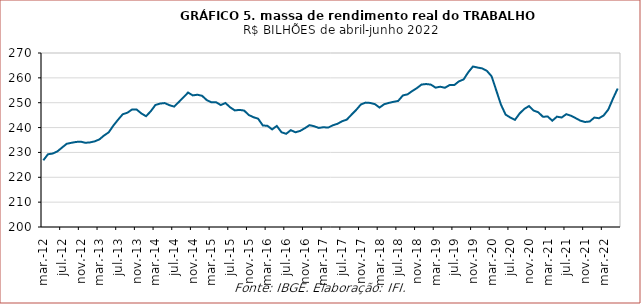
| Category | Massa de rendimento real do trabalho |
|---|---|
| 2012-03-01 | 226834 |
| 2012-04-01 | 229276 |
| 2012-05-01 | 229546 |
| 2012-06-01 | 230411 |
| 2012-07-01 | 231943 |
| 2012-08-01 | 233470 |
| 2012-09-01 | 233874 |
| 2012-10-01 | 234216 |
| 2012-11-01 | 234345 |
| 2012-12-01 | 233879 |
| 2013-01-01 | 234032 |
| 2013-02-01 | 234455 |
| 2013-03-01 | 235233 |
| 2013-04-01 | 236811 |
| 2013-05-01 | 238074 |
| 2013-06-01 | 240798 |
| 2013-07-01 | 243159 |
| 2013-08-01 | 245346 |
| 2013-09-01 | 245982 |
| 2013-10-01 | 247260 |
| 2013-11-01 | 247222 |
| 2013-12-01 | 245670 |
| 2014-01-01 | 244571 |
| 2014-02-01 | 246548 |
| 2014-03-01 | 249080 |
| 2014-04-01 | 249656 |
| 2014-05-01 | 249855 |
| 2014-06-01 | 249010 |
| 2014-07-01 | 248442 |
| 2014-08-01 | 250238 |
| 2014-09-01 | 252174 |
| 2014-10-01 | 254083 |
| 2014-11-01 | 252948 |
| 2014-12-01 | 253214 |
| 2015-01-01 | 252782 |
| 2015-02-01 | 251057 |
| 2015-03-01 | 250140 |
| 2015-04-01 | 250193 |
| 2015-05-01 | 249060 |
| 2015-06-01 | 249889 |
| 2015-07-01 | 248162 |
| 2015-08-01 | 246897 |
| 2015-09-01 | 247117 |
| 2015-10-01 | 246844 |
| 2015-11-01 | 245060 |
| 2015-12-01 | 244170 |
| 2016-01-01 | 243570 |
| 2016-02-01 | 240860 |
| 2016-03-01 | 240694 |
| 2016-04-01 | 239264 |
| 2016-05-01 | 240653 |
| 2016-06-01 | 238121 |
| 2016-07-01 | 237488 |
| 2016-08-01 | 238957 |
| 2016-09-01 | 238106 |
| 2016-10-01 | 238653 |
| 2016-11-01 | 239742 |
| 2016-12-01 | 240977 |
| 2017-01-01 | 240529 |
| 2017-02-01 | 239857 |
| 2017-03-01 | 240144 |
| 2017-04-01 | 239983 |
| 2017-05-01 | 240920 |
| 2017-06-01 | 241521 |
| 2017-07-01 | 242557 |
| 2017-08-01 | 243210 |
| 2017-09-01 | 245201 |
| 2017-10-01 | 247094 |
| 2017-11-01 | 249284 |
| 2017-12-01 | 250041 |
| 2018-01-01 | 249917 |
| 2018-02-01 | 249435 |
| 2018-03-01 | 248054 |
| 2018-04-01 | 249397 |
| 2018-05-01 | 249928 |
| 2018-06-01 | 250357 |
| 2018-07-01 | 250732 |
| 2018-08-01 | 252930 |
| 2018-09-01 | 253372 |
| 2018-10-01 | 254687 |
| 2018-11-01 | 255869 |
| 2018-12-01 | 257311 |
| 2019-01-01 | 257513 |
| 2019-02-01 | 257282 |
| 2019-03-01 | 256060 |
| 2019-04-01 | 256431 |
| 2019-05-01 | 256020 |
| 2019-06-01 | 257087 |
| 2019-07-01 | 257083 |
| 2019-08-01 | 258586 |
| 2019-09-01 | 259364 |
| 2019-10-01 | 262229 |
| 2019-11-01 | 264566 |
| 2019-12-01 | 264143 |
| 2020-01-01 | 263795 |
| 2020-02-01 | 262793 |
| 2020-03-01 | 260633 |
| 2020-04-01 | 254962 |
| 2020-05-01 | 249251 |
| 2020-06-01 | 245215 |
| 2020-07-01 | 244048 |
| 2020-08-01 | 243086 |
| 2020-09-01 | 245655 |
| 2020-10-01 | 247499 |
| 2020-11-01 | 248647 |
| 2020-12-01 | 246851 |
| 2021-01-01 | 246155 |
| 2021-02-01 | 244341 |
| 2021-03-01 | 244468 |
| 2021-04-01 | 242766 |
| 2021-05-01 | 244393 |
| 2021-06-01 | 244044 |
| 2021-07-01 | 245384 |
| 2021-08-01 | 244770 |
| 2021-09-01 | 243801 |
| 2021-10-01 | 242788 |
| 2021-11-01 | 242249 |
| 2021-12-01 | 242434 |
| 2022-01-01 | 244025 |
| 2022-02-01 | 243757 |
| 2022-03-01 | 244875 |
| 2022-04-01 | 247264 |
| 2022-05-01 | 251656 |
| 2022-06-01 | 255707 |